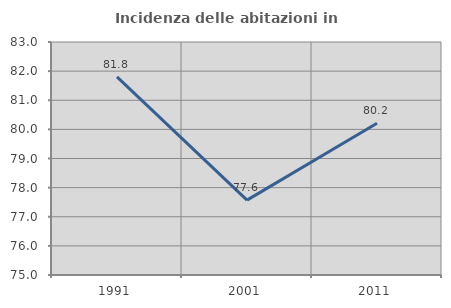
| Category | Incidenza delle abitazioni in proprietà  |
|---|---|
| 1991.0 | 81.805 |
| 2001.0 | 77.571 |
| 2011.0 | 80.212 |